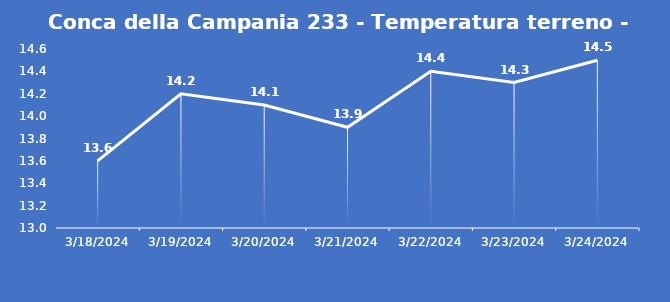
| Category | Conca della Campania 233 - Temperatura terreno - Grezzo (°C) |
|---|---|
| 3/18/24 | 13.6 |
| 3/19/24 | 14.2 |
| 3/20/24 | 14.1 |
| 3/21/24 | 13.9 |
| 3/22/24 | 14.4 |
| 3/23/24 | 14.3 |
| 3/24/24 | 14.5 |